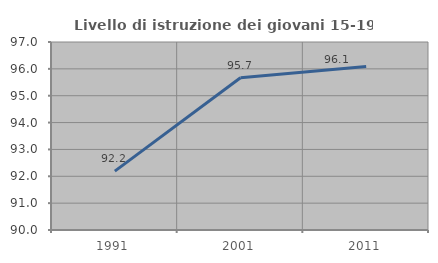
| Category | Livello di istruzione dei giovani 15-19 anni |
|---|---|
| 1991.0 | 92.193 |
| 2001.0 | 95.668 |
| 2011.0 | 96.087 |